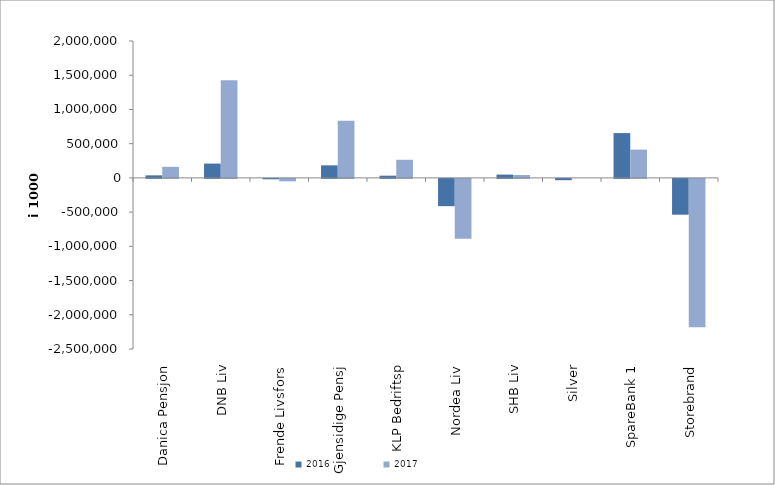
| Category | 2016 | 2017 |
|---|---|---|
| 0 | 37077.396 | 161022.167 |
| 1 | 208921 | 1424944 |
| 2 | -5750.464 | -35332.914 |
| 3 | 183221.284 | 835231 |
| 4 | 32282 | 264421 |
| 5 | -398530.236 | -874319.181 |
| 6 | 48162 | 42014 |
| 7 | -19388 | 0 |
| 8 | 654348.207 | 413293.575 |
| 9 | -523421.858 | -2167031.818 |